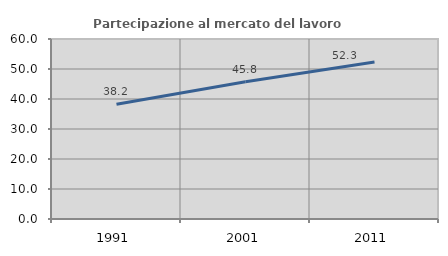
| Category | Partecipazione al mercato del lavoro  femminile |
|---|---|
| 1991.0 | 38.222 |
| 2001.0 | 45.783 |
| 2011.0 | 52.33 |